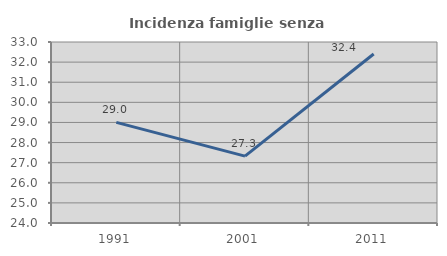
| Category | Incidenza famiglie senza nuclei |
|---|---|
| 1991.0 | 29.002 |
| 2001.0 | 27.327 |
| 2011.0 | 32.403 |